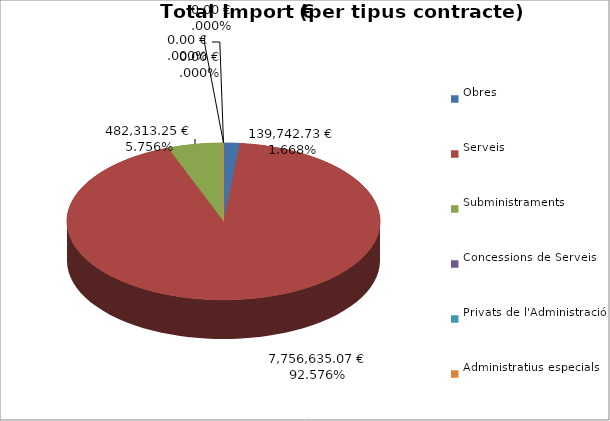
| Category | Total preu
(amb IVA) |
|---|---|
| Obres | 139742.728 |
| Serveis | 7756635.066 |
| Subministraments | 482313.253 |
| Concessions de Serveis | 0 |
| Privats de l'Administració | 0 |
| Administratius especials | 0 |